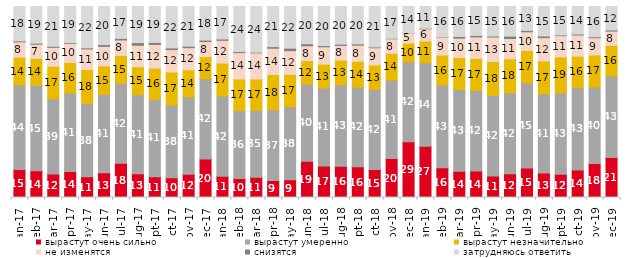
| Category | вырастут очень сильно | вырастут умеренно | вырастут незначительно | не изменятся | снизятся | затрудняюсь ответить |
|---|---|---|---|---|---|---|
| 2017-01-01 | 14.65 | 44.35 | 14.45 | 8.05 | 0.5 | 18 |
| 2017-02-01 | 13.95 | 44.7 | 14.2 | 7.4 | 0.55 | 19.2 |
| 2017-03-01 | 12.25 | 39.35 | 17.15 | 9.85 | 0.55 | 20.85 |
| 2017-04-01 | 13.55 | 41.15 | 16 | 9.95 | 0.4 | 18.95 |
| 2017-05-01 | 10.9 | 38.3 | 17.8 | 10.8 | 0.55 | 21.65 |
| 2017-06-01 | 13 | 40.95 | 15 | 10.2 | 0.95 | 19.9 |
| 2017-07-01 | 17.95 | 41.95 | 14.5 | 8.05 | 0.85 | 16.7 |
| 2017-08-01 | 12.5 | 41.25 | 14.7 | 11.25 | 1.4 | 18.9 |
| 2017-09-01 | 10.9 | 40.55 | 16.3 | 12.4 | 1.05 | 18.8 |
| 2017-10-01 | 10.4 | 37.95 | 17.35 | 11.75 | 0.85 | 21.7 |
| 2017-11-01 | 12.2 | 40.5 | 14.2 | 11.55 | 0.75 | 20.8 |
| 2017-12-01 | 20.1 | 42.05 | 11.6 | 7.9 | 0.75 | 17.6 |
| 2018-01-01 | 11.1 | 42 | 17.25 | 11.95 | 0.7 | 17 |
| 2018-02-01 | 10 | 35.5 | 16.55 | 13.8 | 0.55 | 23.6 |
| 2018-03-01 | 10.65 | 34.9 | 16.5 | 13.7 | 0.35 | 23.9 |
| 2018-04-01 | 8.95 | 37.05 | 18.4 | 13.75 | 0.85 | 21 |
| 2018-05-01 | 9.3 | 38.2 | 16.95 | 12.45 | 1.3 | 21.8 |
| 2018-06-01 | 18.95 | 40.4 | 12.3 | 7.8 | 1.05 | 19.5 |
| 2018-07-01 | 16.55 | 40.75 | 12.55 | 9.05 | 0.65 | 20.45 |
| 2018-08-01 | 16.35 | 42.7 | 12.9 | 7.7 | 0.65 | 19.7 |
| 2018-09-01 | 16.05 | 41.75 | 13.55 | 8.4 | 0.65 | 19.6 |
| 2018-10-01 | 14.6 | 42 | 12.8 | 9 | 0.4 | 21.2 |
| 2018-11-01 | 20.359 | 41.068 | 14.072 | 7.585 | 0.25 | 16.667 |
| 2018-12-01 | 29.25 | 41.8 | 9.8 | 5.4 | 0.1 | 13.65 |
| 2019-01-01 | 26.85 | 43.65 | 11.45 | 6.35 | 0.3 | 11.4 |
| 2019-02-01 | 15.6 | 43.2 | 15.8 | 9.35 | 0.15 | 15.9 |
| 2019-03-01 | 13.774 | 42.715 | 16.808 | 10.144 | 0.845 | 15.714 |
| 2019-04-01 | 13.911 | 42.129 | 16.832 | 11.238 | 0.743 | 15.149 |
| 2019-05-01 | 11.293 | 42.15 | 17.732 | 12.878 | 0.495 | 15.453 |
| 2019-06-01 | 12.419 | 42.444 | 17.756 | 10.623 | 1.247 | 15.511 |
| 2019-07-01 | 15.396 | 44.653 | 16.931 | 9.802 | 0.693 | 12.525 |
| 2019-08-01 | 12.887 | 41.359 | 17.233 | 12.238 | 0.849 | 15.435 |
| 2019-09-01 | 12.228 | 42.574 | 18.812 | 11.139 | 0.347 | 14.901 |
| 2019-10-01 | 14.455 | 43.119 | 16.386 | 11.139 | 0.495 | 14.406 |
| 2019-11-01 | 17.772 | 40.099 | 16.782 | 9.01 | 0.495 | 15.842 |
| 2019-12-01 | 20.891 | 42.772 | 15.941 | 7.525 | 0.594 | 12.277 |